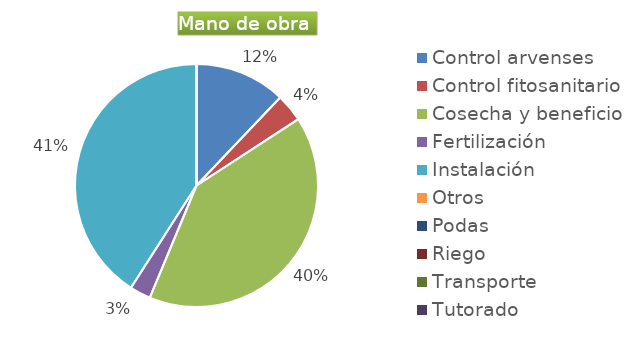
| Category | Series 0 |
|---|---|
| Control arvenses | 941382 |
| Control fitosanitario | 289656 |
| Cosecha y beneficio | 3150000 |
| Fertilización | 217242 |
| Instalación | 3186216 |
| Otros | 0 |
| Podas | 0 |
| Riego | 0 |
| Transporte | 0 |
| Tutorado | 0 |